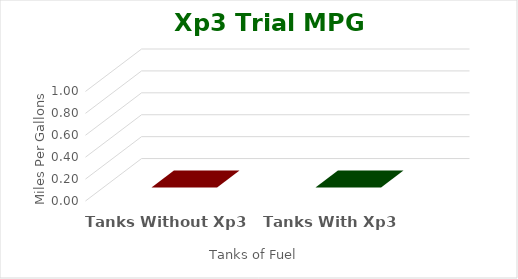
| Category | Series 0 |
|---|---|
| Tanks Without Xp3 | 0 |
| Tanks With Xp3 | 0 |